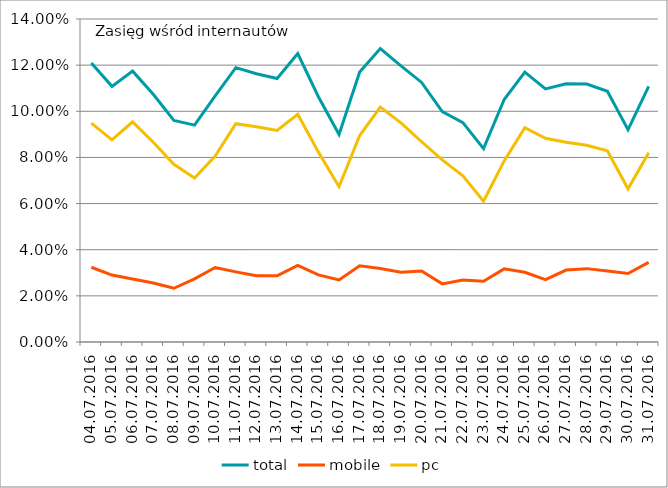
| Category | total | mobile | pc |
|---|---|---|---|
| 04.07.2016 | 0.121 | 0.032 | 0.095 |
| 05.07.2016 | 0.111 | 0.029 | 0.088 |
| 06.07.2016 | 0.117 | 0.027 | 0.095 |
| 07.07.2016 | 0.107 | 0.026 | 0.087 |
| 08.07.2016 | 0.096 | 0.023 | 0.077 |
| 09.07.2016 | 0.094 | 0.027 | 0.071 |
| 10.07.2016 | 0.107 | 0.032 | 0.081 |
| 11.07.2016 | 0.119 | 0.03 | 0.095 |
| 12.07.2016 | 0.116 | 0.029 | 0.093 |
| 13.07.2016 | 0.114 | 0.029 | 0.092 |
| 14.07.2016 | 0.125 | 0.033 | 0.099 |
| 15.07.2016 | 0.106 | 0.029 | 0.082 |
| 16.07.2016 | 0.09 | 0.027 | 0.067 |
| 17.07.2016 | 0.117 | 0.033 | 0.09 |
| 18.07.2016 | 0.127 | 0.032 | 0.102 |
| 19.07.2016 | 0.12 | 0.03 | 0.095 |
| 20.07.2016 | 0.112 | 0.031 | 0.087 |
| 21.07.2016 | 0.1 | 0.025 | 0.079 |
| 22.07.2016 | 0.095 | 0.027 | 0.072 |
| 23.07.2016 | 0.084 | 0.026 | 0.061 |
| 24.07.2016 | 0.105 | 0.032 | 0.078 |
| 25.07.2016 | 0.117 | 0.03 | 0.093 |
| 26.07.2016 | 0.11 | 0.027 | 0.088 |
| 27.07.2016 | 0.112 | 0.031 | 0.087 |
| 28.07.2016 | 0.112 | 0.032 | 0.085 |
| 29.07.2016 | 0.109 | 0.031 | 0.083 |
| 30.07.2016 | 0.092 | 0.03 | 0.066 |
| 31.07.2016 | 0.111 | 0.034 | 0.082 |